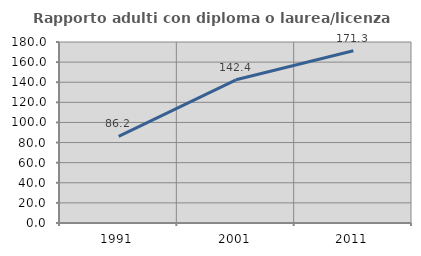
| Category | Rapporto adulti con diploma o laurea/licenza media  |
|---|---|
| 1991.0 | 86.167 |
| 2001.0 | 142.386 |
| 2011.0 | 171.285 |